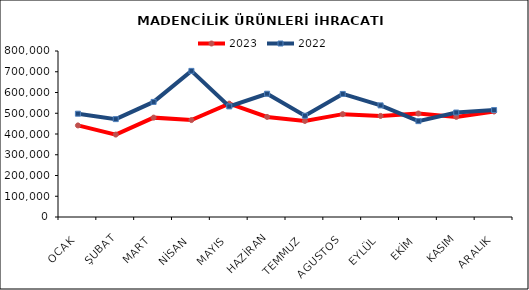
| Category | 2023 | 2022 |
|---|---|---|
| OCAK | 441306.825 | 497849.896 |
| ŞUBAT | 397254.845 | 471704.263 |
| MART | 478851.45 | 554613.889 |
| NİSAN | 467165.446 | 704145.16 |
| MAYIS | 546205.852 | 533041.872 |
| HAZİRAN | 482339.122 | 594051.504 |
| TEMMUZ | 462882.704 | 487987.185 |
| AGUSTOS | 495647.42 | 593089.544 |
| EYLÜL | 487099.32 | 537861.994 |
| EKİM | 498679.89 | 462008.545 |
| KASIM | 482442.367 | 503422.248 |
| ARALIK | 508428.61 | 515319.926 |